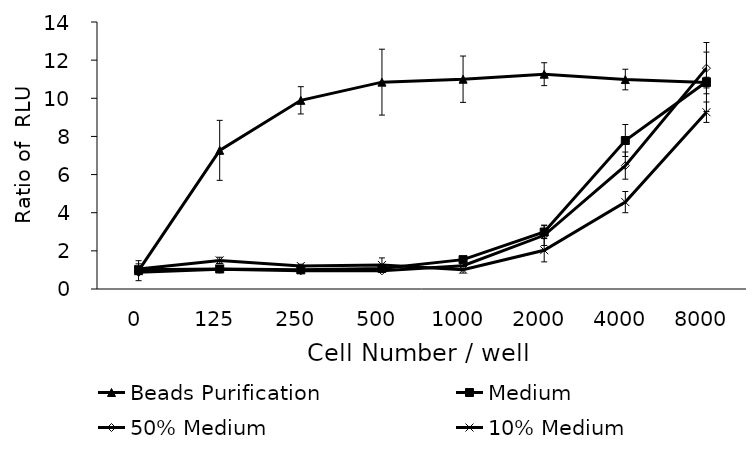
| Category | Beads Purification | Medium | 50% Medium | 10% Medium |
|---|---|---|---|---|
| 0.0 | 0.96 | 1.01 | 0.873 | 1.05 |
| 125.0 | 7.27 | 1.05 | 1.033 | 1.5 |
| 250.0 | 9.893 | 1.003 | 0.953 | 1.207 |
| 500.0 | 10.847 | 1.08 | 0.953 | 1.26 |
| 1000.0 | 11 | 1.54 | 1.22 | 1.013 |
| 2000.0 | 11.263 | 2.987 | 2.817 | 2.033 |
| 4000.0 | 10.983 | 7.787 | 6.47 | 4.557 |
| 8000.0 | 10.823 | 10.863 | 11.58 | 9.27 |